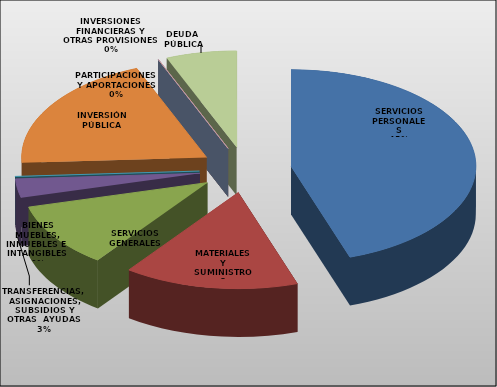
| Category | Series 0 |
|---|---|
| SERVICIOS PERSONALES | 26987027 |
| MATERIALES Y SUMINISTROS | 9189000 |
| SERVICIOS GENERALES | 6507600 |
| TRANSFERENCIAS, ASIGNACIONES, SUBSIDIOS Y OTRAS  AYUDAS | 1905000 |
| BIENES MUEBLES, INMUEBLES E  INTANGIBLES  | 22899 |
| INVERSIÓN PÚBLICA | 11875887 |
| INVERSIONES FINANCIERAS Y OTRAS PROVISIONES | 0 |
| PARTICIPACIONES Y APORTACIONES | 0 |
| DEUDA  PÚBLICA | 3712858 |